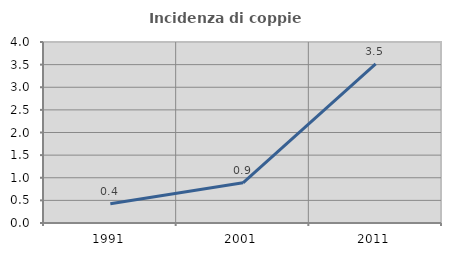
| Category | Incidenza di coppie miste |
|---|---|
| 1991.0 | 0.426 |
| 2001.0 | 0.889 |
| 2011.0 | 3.518 |